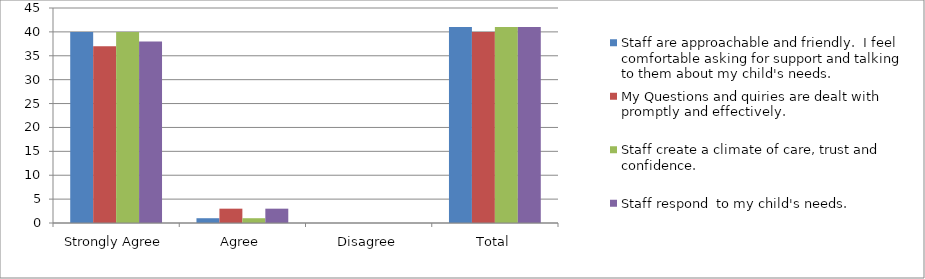
| Category | Staff are approachable and friendly.  I feel comfortable asking for support and talking to them about my child's needs. | My Questions and quiries are dealt with promptly and effectively. | Staff create a climate of care, trust and confidence. | Staff respond  to my child's needs. |
|---|---|---|---|---|
| Strongly Agree | 40 | 37 | 40 | 38 |
| Agree | 1 | 3 | 1 | 3 |
| Disagree | 0 | 0 | 0 | 0 |
| Total | 41 | 40 | 41 | 41 |